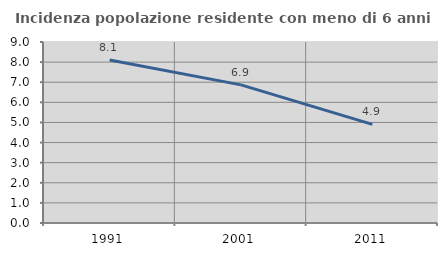
| Category | Incidenza popolazione residente con meno di 6 anni |
|---|---|
| 1991.0 | 8.103 |
| 2001.0 | 6.868 |
| 2011.0 | 4.906 |